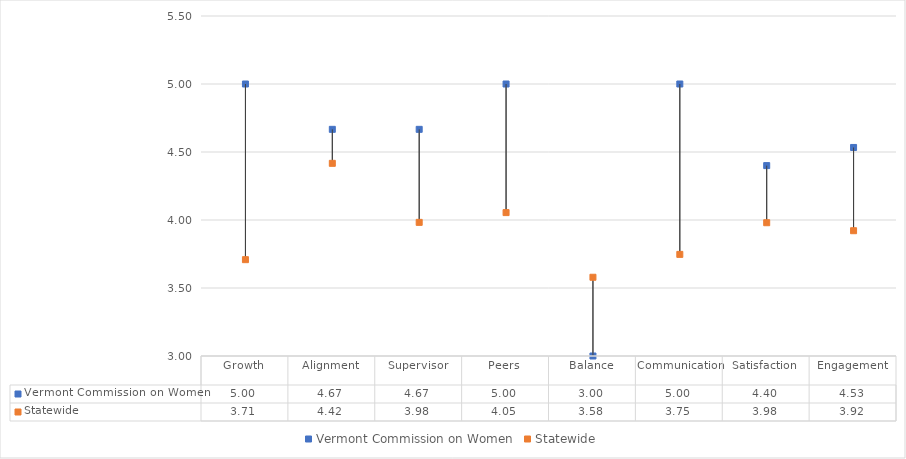
| Category | Vermont Commission on Women | Statewide |
|---|---|---|
| Growth | 5 | 3.708 |
| Alignment | 4.667 | 4.417 |
| Supervisor | 4.667 | 3.983 |
| Peers | 5 | 4.054 |
| Balance | 3 | 3.579 |
| Communication | 5 | 3.747 |
| Satisfaction | 4.4 | 3.98 |
| Engagement | 4.533 | 3.921 |